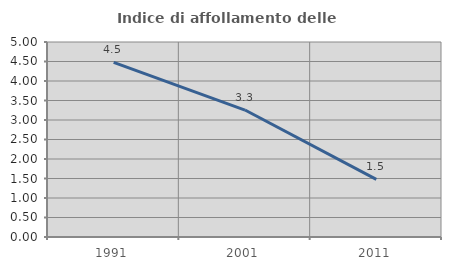
| Category | Indice di affollamento delle abitazioni  |
|---|---|
| 1991.0 | 4.477 |
| 2001.0 | 3.256 |
| 2011.0 | 1.479 |